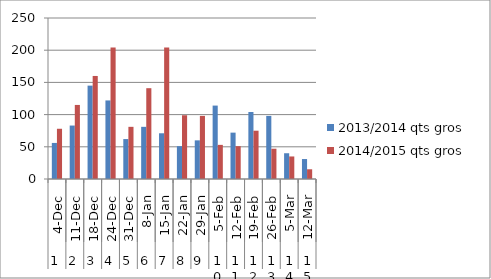
| Category | 2013/2014 qts gros  | 2014/2015 qts gros  |
|---|---|---|
| 0 | 56 | 78 |
| 1 | 83 | 115 |
| 2 | 145 | 160 |
| 3 | 122 | 204 |
| 4 | 62 | 81 |
| 5 | 81 | 141 |
| 6 | 71 | 204 |
| 7 | 51 | 99 |
| 8 | 60 | 98 |
| 9 | 114 | 53 |
| 10 | 72 | 51 |
| 11 | 104 | 75 |
| 12 | 98 | 47 |
| 13 | 40 | 35 |
| 14 | 31 | 15.1 |